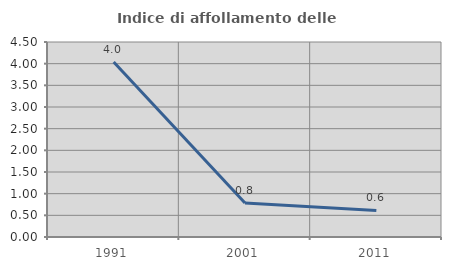
| Category | Indice di affollamento delle abitazioni  |
|---|---|
| 1991.0 | 4.04 |
| 2001.0 | 0.785 |
| 2011.0 | 0.612 |